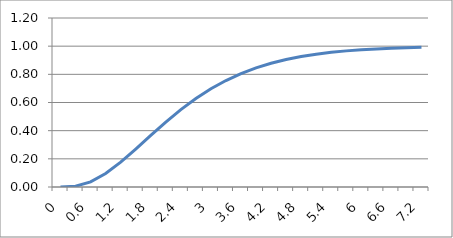
| Category | Series 0 |
|---|---|
| 0.0 | 0 |
| 0.3 | 0.006 |
| 0.6 | 0.037 |
| 0.9 | 0.096 |
| 1.2 | 0.176 |
| 1.5 | 0.269 |
| 1.8 | 0.367 |
| 2.1 | 0.461 |
| 2.4 | 0.549 |
| 2.7 | 0.628 |
| 3.0 | 0.697 |
| 3.3 | 0.756 |
| 3.6 | 0.805 |
| 3.9 | 0.846 |
| 4.2 | 0.879 |
| 4.5 | 0.905 |
| 4.8 | 0.926 |
| 5.1 | 0.943 |
| 5.4 | 0.956 |
| 5.7 | 0.967 |
| 6.0 | 0.975 |
| 6.3 | 0.981 |
| 6.6 | 0.985 |
| 6.9 | 0.989 |
| 7.2 | 0.992 |